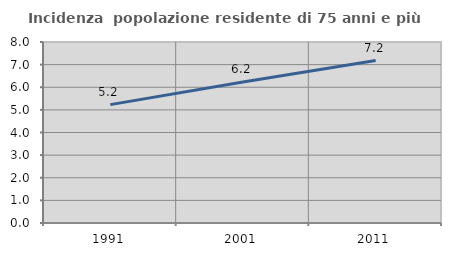
| Category | Incidenza  popolazione residente di 75 anni e più |
|---|---|
| 1991.0 | 5.232 |
| 2001.0 | 6.23 |
| 2011.0 | 7.181 |